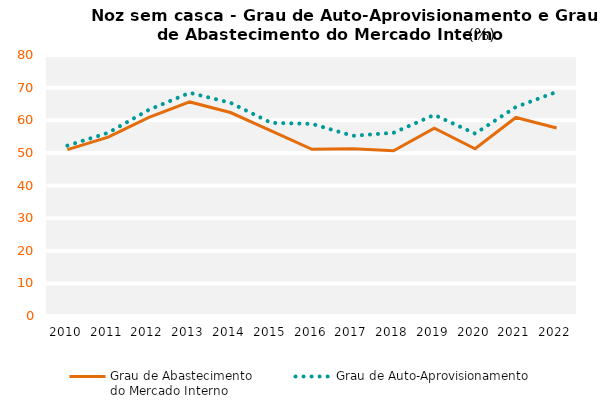
| Category | Grau de Abastecimento
do Mercado Interno | Grau de Auto-Aprovisionamento |
|---|---|---|
| 2010.0 | 50.981 | 52.223 |
| 2011.0 | 54.838 | 56.145 |
| 2012.0 | 60.886 | 63.206 |
| 2013.0 | 65.616 | 68.417 |
| 2014.0 | 62.37 | 65.35 |
| 2015.0 | 56.733 | 59.207 |
| 2016.0 | 51.086 | 58.882 |
| 2017.0 | 51.258 | 55.231 |
| 2018.0 | 50.67 | 56.162 |
| 2019.0 | 57.551 | 61.639 |
| 2020.0 | 51.253 | 55.908 |
| 2021.0 | 60.853 | 64.045 |
| 2022.0 | 57.612 | 68.69 |